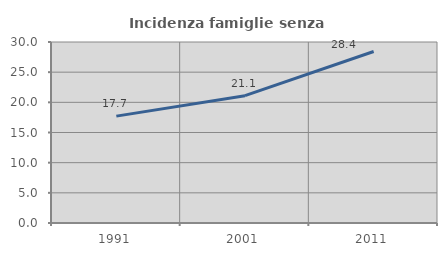
| Category | Incidenza famiglie senza nuclei |
|---|---|
| 1991.0 | 17.713 |
| 2001.0 | 21.105 |
| 2011.0 | 28.419 |